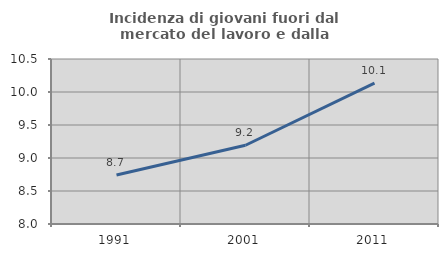
| Category | Incidenza di giovani fuori dal mercato del lavoro e dalla formazione  |
|---|---|
| 1991.0 | 8.743 |
| 2001.0 | 9.193 |
| 2011.0 | 10.135 |